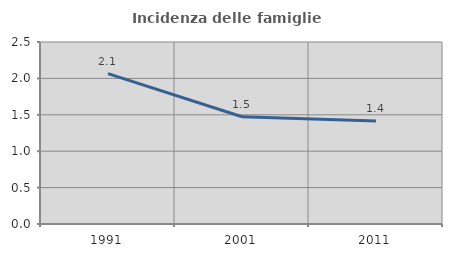
| Category | Incidenza delle famiglie numerose |
|---|---|
| 1991.0 | 2.066 |
| 2001.0 | 1.473 |
| 2011.0 | 1.416 |